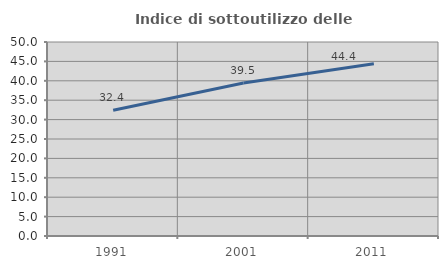
| Category | Indice di sottoutilizzo delle abitazioni  |
|---|---|
| 1991.0 | 32.403 |
| 2001.0 | 39.457 |
| 2011.0 | 44.416 |